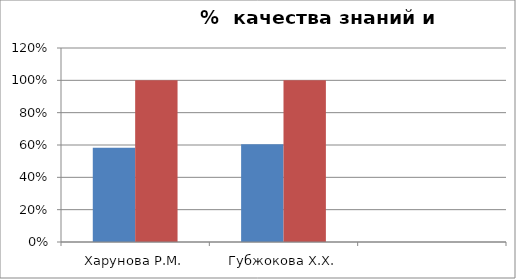
| Category | Series 0 | 2 |
|---|---|---|
| Харунова Р.М. | 0.582 | 1 |
| Губжокова Х.Х. | 0.605 | 1 |